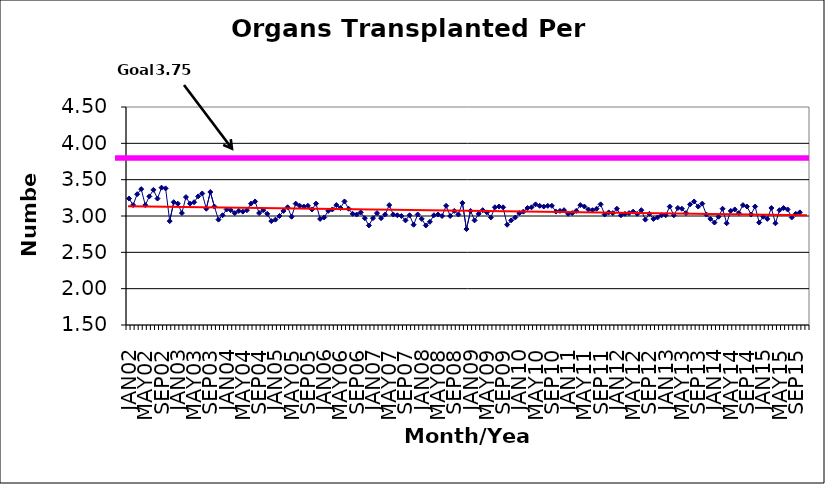
| Category | Series 0 |
|---|---|
| JAN02 | 3.24 |
| FEB02 | 3.15 |
| MAR02 | 3.3 |
| APR02 | 3.37 |
| MAY02 | 3.15 |
| JUN02 | 3.27 |
| JUL02 | 3.36 |
| AUG02 | 3.24 |
| SEP02 | 3.39 |
| OCT02 | 3.38 |
| NOV02 | 2.93 |
| DEC02 | 3.19 |
| JAN03 | 3.17 |
| FEB03 | 3.04 |
| MAR03 | 3.26 |
| APR03 | 3.17 |
| MAY03 | 3.19 |
| JUN03 | 3.27 |
| JUL03 | 3.31 |
| AUG03 | 3.1 |
| SEP03 | 3.33 |
| OCT03 | 3.13 |
| NOV03 | 2.95 |
| DEC03 | 3.01 |
| JAN04 | 3.09 |
| FEB04 | 3.08 |
| MAR04 | 3.04 |
| APR04 | 3.07 |
| MAY04 | 3.06 |
| JUN04 | 3.08 |
| JUL04 | 3.17 |
| AUG04 | 3.2 |
| SEP04 | 3.04 |
| OCT04 | 3.08 |
| NOV04 | 3.03 |
| DEC04 | 2.93 |
| JAN05 | 2.95 |
| FEB05 | 3 |
| MAR05 | 3.07 |
| APR05 | 3.12 |
| MAY05 | 2.99 |
| JUN05 | 3.17 |
| JUL05 | 3.14 |
| AUG05 | 3.13 |
| SEP05 | 3.14 |
| OCT05 | 3.09 |
| NOV05 | 3.17 |
| DEC05 | 2.96 |
| JAN06 | 2.98 |
| FEB06 | 3.07 |
| MAR06 | 3.09 |
| APR06 | 3.15 |
| MAY06 | 3.11 |
| JUN06 | 3.2 |
| JUL06 | 3.1 |
| AUG06 | 3.03 |
| SEP06 | 3.02 |
| OCT06 | 3.05 |
| NOV06 | 2.97 |
| DEC06 | 2.87 |
| JAN07 | 2.97 |
| FEB07 | 3.04 |
| MAR07 | 2.97 |
| APR07 | 3.02 |
| MAY07 | 3.15 |
| JUN07 | 3.02 |
| JUL07 | 3.01 |
| AUG07 | 3 |
| SEP07 | 2.94 |
| OCT07 | 3.01 |
| NOV07 | 2.88 |
| DEC07 | 3.02 |
| JAN08 | 2.96 |
| FEB08 | 2.87 |
| MAR08 | 2.92 |
| APR08 | 3.01 |
| MAY08 | 3.02 |
| JUN08 | 3 |
| JUL08 | 3.14 |
| AUG08 | 3 |
| SEP08 | 3.07 |
| OCT08 | 3.02 |
| NOV08 | 3.18 |
| DEC08 | 2.82 |
| JAN09 | 3.07 |
| FEB09 | 2.94 |
| MAR09 | 3.03 |
| APR09 | 3.08 |
| MAY09 | 3.05 |
| JUN09 | 2.98 |
| JUL09 | 3.12 |
| AUG09 | 3.13 |
| SEP09 | 3.12 |
| OCT09 | 2.88 |
| NOV09 | 2.94 |
| DEC09 | 2.98 |
| JAN10 | 3.04 |
| FEB10 | 3.06 |
| MAR10 | 3.11 |
| APR10 | 3.12 |
| MAY10 | 3.16 |
| JUN10 | 3.14 |
| JUL10 | 3.13 |
| AUG10 | 3.14 |
| SEP10 | 3.14 |
| OCT10 | 3.06 |
| NOV10 | 3.07 |
| DEC10 | 3.08 |
| JAN11 | 3.03 |
| FEB11 | 3.04 |
| MAR11 | 3.07 |
| APR11 | 3.15 |
| MAY11 | 3.13 |
| JUN11 | 3.09 |
| JUL11 | 3.08 |
| AUG11 | 3.1 |
| SEP11 | 3.16 |
| OCT11 | 3.02 |
| NOV11 | 3.05 |
| DEC11 | 3.04 |
| JAN12 | 3.1 |
| FEB12 | 3.01 |
| MAR12 | 3.03 |
| APR12 | 3.04 |
| MAY12 | 3.06 |
| JUN12 | 3.03 |
| JUL12 | 3.08 |
| AUG12 | 2.95 |
| SEP12 | 3.03 |
| OCT12 | 2.96 |
| NOV12 | 2.98 |
| DEC12 | 3.01 |
| JAN13 | 3.01 |
| FEB13 | 3.13 |
| MAR13 | 3.01 |
| APR13 | 3.11 |
| MAY13 | 3.1 |
| JUN13 | 3.04 |
| JUL13 | 3.16 |
| AUG13 | 3.2 |
| SEP13 | 3.13 |
| OCT13 | 3.17 |
| NOV13 | 3.02 |
| DEC13 | 2.96 |
| JAN14 | 2.91 |
| FEB14 | 2.99 |
| MAR14 | 3.1 |
| APR14 | 2.9 |
| MAY14 | 3.07 |
| JUN14 | 3.09 |
| JUL14 | 3.04 |
| AUG14 | 3.15 |
| SEP14 | 3.13 |
| OCT14 | 3.02 |
| NOV14 | 3.13 |
| DEC14 | 2.91 |
| JAN15 | 2.99 |
| FEB15 | 2.96 |
| MAR15 | 3.11 |
| APR15 | 2.9 |
| MAY15 | 3.08 |
| JUN15 | 3.11 |
| JUL15 | 3.09 |
| AUG15 | 2.98 |
| SEP15 | 3.03 |
| OCT15 | 3.05 |